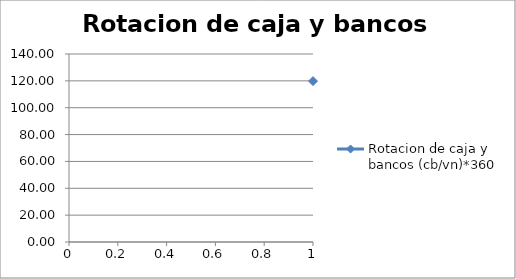
| Category | Rotacion de caja y bancos (cb/vn)*360 |
|---|---|
| 0 | 119.812 |
| 1 | 120.757 |
| 2 | 104.407 |
| 3 | 104.129 |
| 4 | 120.757 |
| 5 | 120.201 |
| 6 | 104.407 |
| 7 | 16.402 |